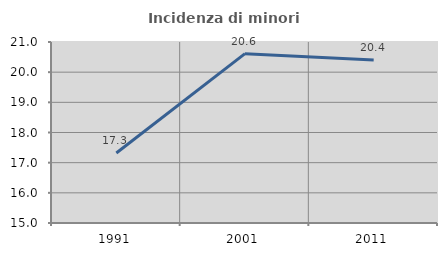
| Category | Incidenza di minori stranieri |
|---|---|
| 1991.0 | 17.318 |
| 2001.0 | 20.614 |
| 2011.0 | 20.403 |